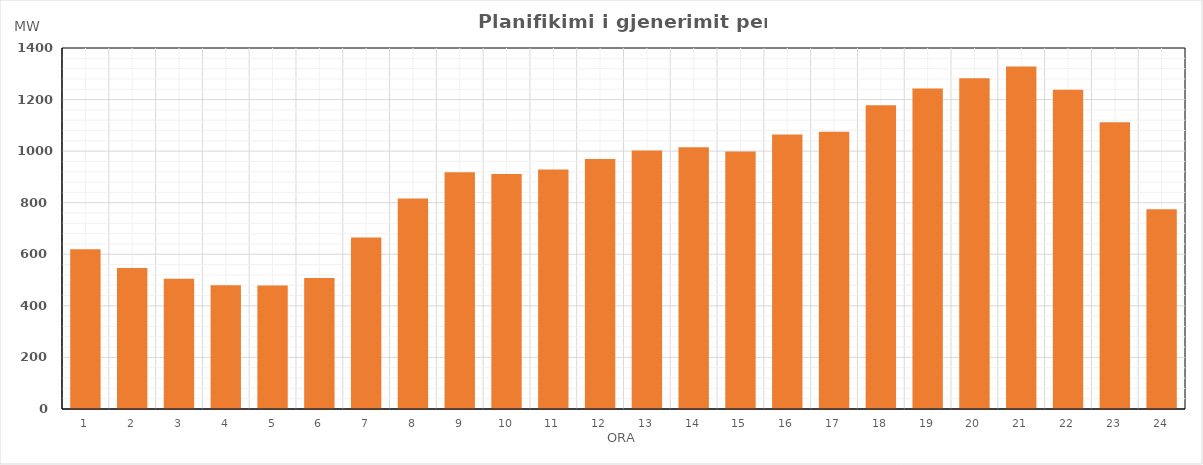
| Category | Max (MW) |
|---|---|
| 0 | 619.6 |
| 1 | 546.6 |
| 2 | 505.6 |
| 3 | 479.6 |
| 4 | 478.6 |
| 5 | 508.372 |
| 6 | 665.091 |
| 7 | 815.9 |
| 8 | 918.252 |
| 9 | 911.123 |
| 10 | 928.617 |
| 11 | 969.441 |
| 12 | 1002.822 |
| 13 | 1015.575 |
| 14 | 999.035 |
| 15 | 1064.6 |
| 16 | 1075.6 |
| 17 | 1178.282 |
| 18 | 1242.9 |
| 19 | 1282.6 |
| 20 | 1327.871 |
| 21 | 1237.856 |
| 22 | 1112.287 |
| 23 | 774.6 |